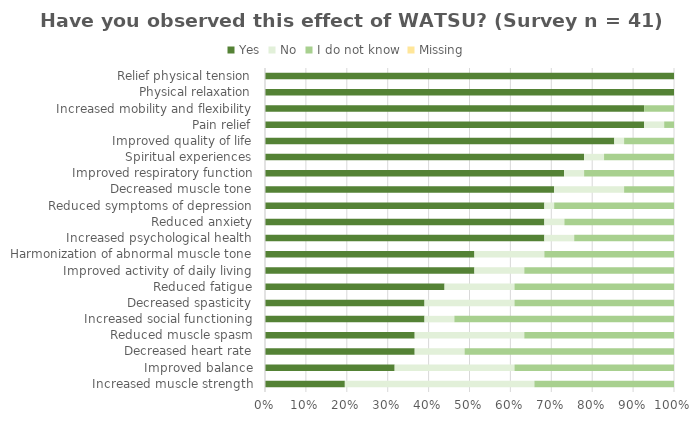
| Category | Yes | No | I do not know | Missing |
|---|---|---|---|---|
| Relief physical tension | 100 | 0 | 0 | 0 |
| Physical relaxation | 100 | 0 | 0 | 0 |
| Increased mobility and flexibility | 92.7 | 0 | 7.3 | 0 |
| Pain relief | 92.7 | 4.9 | 2.4 | 0 |
| Improved quality of life | 85.4 | 2.4 | 12.2 | 0 |
| Spiritual experiences | 78 | 4.9 | 17.1 | 0 |
| Improved respiratory function | 73.2 | 4.9 | 22 | 0 |
| Decreased muscle tone | 70.7 | 17.1 | 12.2 | 0 |
| Reduced symptoms of depression | 68.3 | 2.4 | 29.3 | 0 |
| Reduced anxiety | 68.3 | 4.9 | 26.8 | 0 |
| Increased psychological health | 68.3 | 7.3 | 24.4 | 0 |
| Harmonization of abnormal muscle tone | 51.2 | 17.1 | 31.7 | 0 |
| Improved activity of daily living | 51.2 | 12.2 | 36.6 | 0 |
| Reduced fatigue | 43.9 | 17.1 | 39 | 0 |
| Decreased spasticity | 39 | 22 | 39 | 0 |
| Increased social functioning | 39 | 7.3 | 53.7 | 0 |
| Reduced muscle spasm | 36.6 | 26.8 | 36.6 | 0 |
| Decreased heart rate | 36.6 | 12.2 | 51.2 | 0 |
| Improved balance | 31.7 | 29.3 | 39 | 0 |
| Increased muscle strength | 19.5 | 46.3 | 34.1 | 0 |